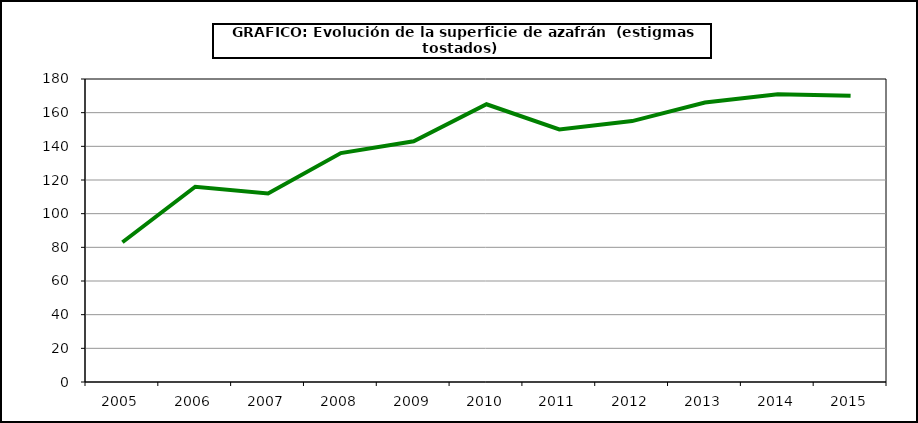
| Category | Superficie |
|---|---|
| 2005.0 | 83 |
| 2006.0 | 116 |
| 2007.0 | 112 |
| 2008.0 | 136 |
| 2009.0 | 143 |
| 2010.0 | 165 |
| 2011.0 | 150 |
| 2012.0 | 155 |
| 2013.0 | 166 |
| 2014.0 | 171 |
| 2015.0 | 170 |